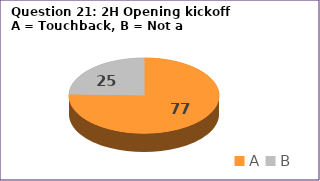
| Category | Series 0 |
|---|---|
| A | 77 |
| B | 25 |